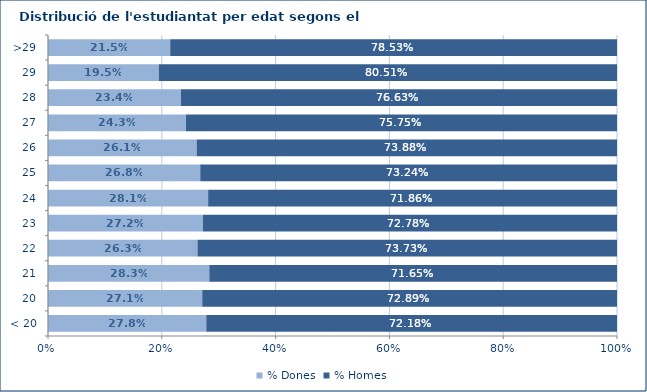
| Category | % Dones | % Homes |
|---|---|---|
| < 20 | 0.278 | 0.722 |
| 20 | 0.271 | 0.729 |
| 21 | 0.283 | 0.717 |
| 22 | 0.263 | 0.737 |
| 23 | 0.272 | 0.728 |
| 24 | 0.281 | 0.719 |
| 25 | 0.268 | 0.732 |
| 26 | 0.261 | 0.739 |
| 27 | 0.243 | 0.757 |
| 28 | 0.234 | 0.766 |
| 29 | 0.195 | 0.805 |
| >29 | 0.215 | 0.785 |